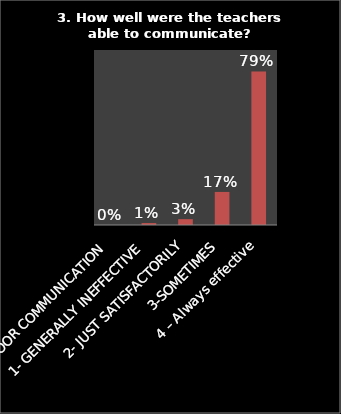
| Category | Series 0 |
|---|---|
| 0- VERY POOR COMMUNICATION | 0 |
| 1- GENERALLY INEFFECTIVE | 0.01 |
| 2- JUST SATISFACTORILY | 0.03 |
| 3-SOMETIMES | 0.17 |
| 4 – Always effective | 0.79 |